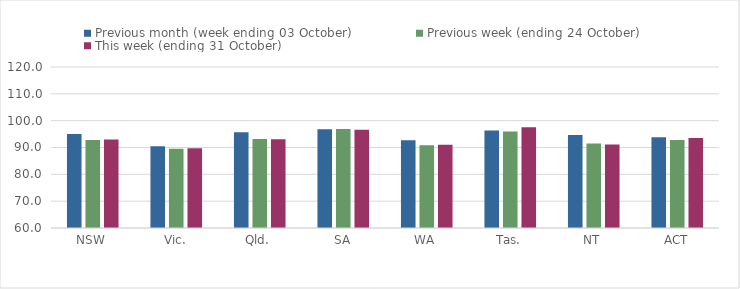
| Category | Previous month (week ending 03 October) | Previous week (ending 24 October) | This week (ending 31 October) |
|---|---|---|---|
| NSW | 95.04 | 92.82 | 92.94 |
| Vic. | 90.45 | 89.56 | 89.73 |
| Qld. | 95.67 | 93.14 | 93.03 |
| SA | 96.81 | 96.89 | 96.61 |
| WA | 92.68 | 90.82 | 90.98 |
| Tas. | 96.35 | 95.95 | 97.58 |
| NT | 94.7 | 91.46 | 91.08 |
| ACT | 93.86 | 92.76 | 93.57 |